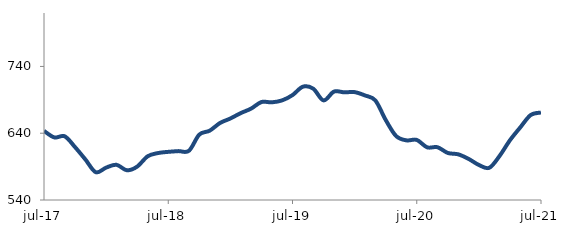
| Category | Series 0 |
|---|---|
| 2017-07-01 | 643.488 |
| 2017-08-01 | 633.681 |
| 2017-09-01 | 635.346 |
| 2017-10-01 | 619.124 |
| 2017-11-01 | 600.625 |
| 2017-12-01 | 581.589 |
| 2018-01-01 | 588.491 |
| 2018-02-01 | 592.7 |
| 2018-03-01 | 584.54 |
| 2018-04-01 | 590.003 |
| 2018-05-01 | 605.353 |
| 2018-06-01 | 610.275 |
| 2018-07-01 | 612.086 |
| 2018-08-01 | 613.193 |
| 2018-09-01 | 613.735 |
| 2018-10-01 | 637.954 |
| 2018-11-01 | 643.773 |
| 2018-12-01 | 655.34 |
| 2019-01-01 | 662.041 |
| 2019-02-01 | 670.134 |
| 2019-03-01 | 676.827 |
| 2019-04-01 | 686.669 |
| 2019-05-01 | 686.255 |
| 2019-06-01 | 689.181 |
| 2019-07-01 | 697.076 |
| 2019-08-01 | 709.635 |
| 2019-09-01 | 706.734 |
| 2019-10-01 | 689.137 |
| 2019-11-01 | 702.277 |
| 2019-12-01 | 701.214 |
| 2020-01-01 | 701.517 |
| 2020-02-01 | 696.552 |
| 2020-03-01 | 689.099 |
| 2020-04-01 | 659.896 |
| 2020-05-01 | 635.894 |
| 2020-06-01 | 629.29 |
| 2020-07-01 | 629.994 |
| 2020-08-01 | 618.866 |
| 2020-09-01 | 619.022 |
| 2020-10-01 | 610.428 |
| 2020-11-01 | 608.402 |
| 2020-12-01 | 601.605 |
| 2021-01-01 | 592.504 |
| 2021-02-01 | 588.185 |
| 2021-03-01 | 605.989 |
| 2021-04-01 | 629.446 |
| 2021-05-01 | 648.73 |
| 2021-06-01 | 667.177 |
| 2021-07-01 | 670.996 |